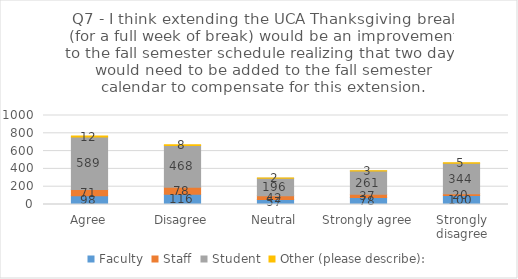
| Category | Faculty | Staff | Student | Other (please describe): |
|---|---|---|---|---|
| Agree | 98 | 71 | 589 | 12 |
| Disagree | 116 | 78 | 468 | 8 |
| Neutral | 57 | 42 | 196 | 2 |
| Strongly agree | 78 | 37 | 261 | 3 |
| Strongly disagree | 100 | 20 | 344 | 5 |